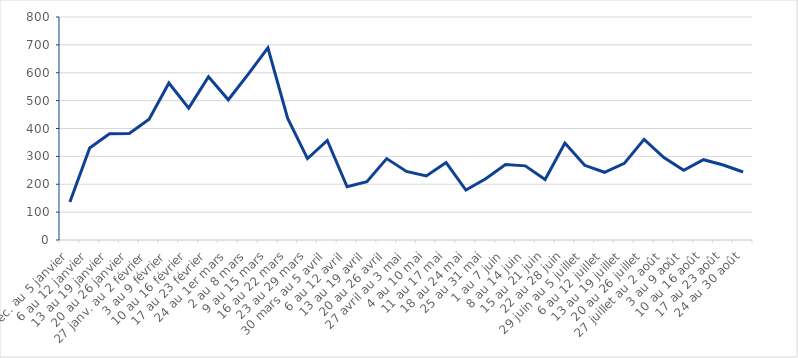
| Category | 2020 |
|---|---|
| 30 déc. au 5 janvier | 136 |
| 6 au 12 janvier | 330 |
| 13 au 19 janvier | 381 |
| 20 au 26 janvier | 382 |
| 27 janv. au 2 février | 433 |
| 3 au 9 février | 563 |
| 10 au 16 février | 473 |
| 17 au 23 février | 586 |
| 24 au 1er mars | 503 |
| 2 au 8 mars | 594 |
| 9 au 15 mars | 689 |
| 16 au 22 mars | 436 |
| 23 au 29 mars | 292 |
| 30 mars au 5 avril | 357 |
| 6 au 12 avril | 191 |
| 13 au 19 avril | 209 |
| 20 au 26 avril | 292 |
| 27 avril au 3 mai | 246 |
| 4 au 10 mai | 230 |
| 11 au 17 mai | 278 |
| 18 au 24 mai | 179 |
| 25 au 31 mai | 220 |
| 1 au 7 juin | 271 |
| 8 au 14 juin | 266 |
| 15 au 21 juin | 217 |
| 22 au 28 juin | 348 |
| 29 juin au 5 juillet | 268 |
| 6 au 12 juillet | 243 |
| 13 au 19 juillet | 275 |
| 20 au 26 juillet | 361 |
| 27 juillet au 2 août | 296 |
| 3 au 9 août | 250 |
| 10 au 16 août | 288 |
| 17 au 23 août | 269 |
| 24 au 30 août | 244 |